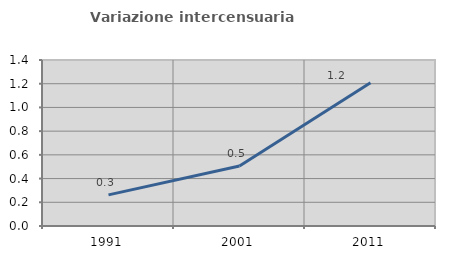
| Category | Variazione intercensuaria annua |
|---|---|
| 1991.0 | 0.263 |
| 2001.0 | 0.506 |
| 2011.0 | 1.207 |